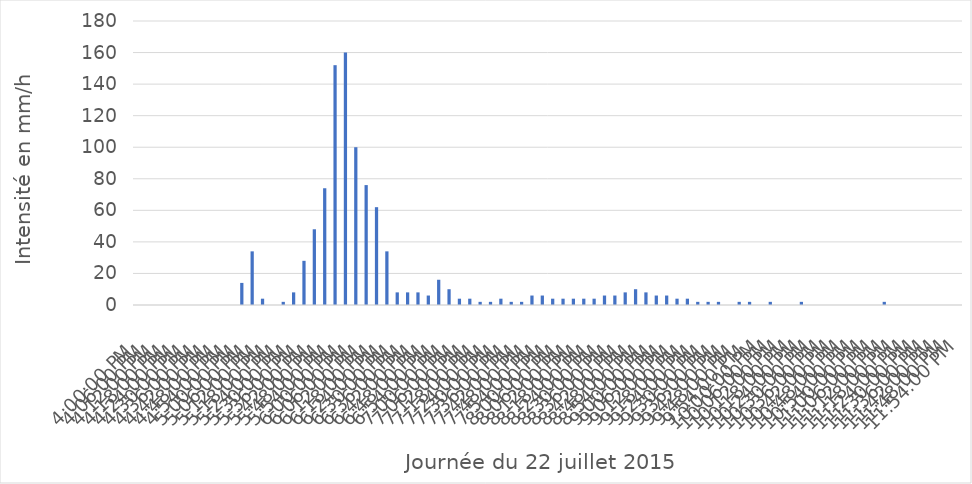
| Category | Series 0 |
|---|---|
| 2015-07-22 16:00:00 | 0 |
| 2015-07-22 16:06:00 | 0 |
| 2015-07-22 16:12:00 | 0 |
| 2015-07-22 16:18:00 | 0 |
| 2015-07-22 16:24:00 | 0 |
| 2015-07-22 16:30:00 | 0 |
| 2015-07-22 16:36:00 | 0 |
| 2015-07-22 16:42:00 | 0 |
| 2015-07-22 16:48:00 | 0 |
| 2015-07-22 16:54:00 | 0 |
| 2015-07-22 17:00:00 | 14 |
| 2015-07-22 17:06:00 | 34 |
| 2015-07-22 17:12:00 | 4 |
| 2015-07-22 17:18:00 | 0 |
| 2015-07-22 17:24:00 | 2 |
| 2015-07-22 17:30:00 | 8 |
| 2015-07-22 17:36:00 | 28 |
| 2015-07-22 17:42:00 | 48 |
| 2015-07-22 17:48:00 | 74 |
| 2015-07-22 17:54:00 | 152 |
| 2015-07-22 18:00:00 | 160 |
| 2015-07-22 18:06:00 | 100 |
| 2015-07-22 18:12:00 | 76 |
| 2015-07-22 18:18:00 | 62 |
| 2015-07-22 18:24:00 | 34 |
| 2015-07-22 18:30:00 | 8 |
| 2015-07-22 18:36:00 | 8 |
| 2015-07-22 18:42:00 | 8 |
| 2015-07-22 18:48:00 | 6 |
| 2015-07-22 18:54:00 | 16 |
| 2015-07-22 19:00:00 | 10 |
| 2015-07-22 19:06:00 | 4 |
| 2015-07-22 19:12:00 | 4 |
| 2015-07-22 19:18:00 | 2 |
| 2015-07-22 19:24:00 | 2 |
| 2015-07-22 19:30:00 | 4 |
| 2015-07-22 19:36:00 | 2 |
| 2015-07-22 19:42:00 | 2 |
| 2015-07-22 19:48:00 | 6 |
| 2015-07-22 19:54:00 | 6 |
| 2015-07-22 20:00:00 | 4 |
| 2015-07-22 20:06:00 | 4 |
| 2015-07-22 20:12:00 | 4 |
| 2015-07-22 20:18:00 | 4 |
| 2015-07-22 20:24:00 | 4 |
| 2015-07-22 20:30:00 | 6 |
| 2015-07-22 20:36:00 | 6 |
| 2015-07-22 20:42:00 | 8 |
| 2015-07-22 20:48:00 | 10 |
| 2015-07-22 20:54:00 | 8 |
| 2015-07-22 21:00:00 | 6 |
| 2015-07-22 21:06:00 | 6 |
| 2015-07-22 21:12:00 | 4 |
| 2015-07-22 21:18:00 | 4 |
| 2015-07-22 21:24:00 | 2 |
| 2015-07-22 21:30:00 | 2 |
| 2015-07-22 21:36:00 | 2 |
| 2015-07-22 21:42:00 | 0 |
| 2015-07-22 21:48:00 | 2 |
| 2015-07-22 21:54:00 | 2 |
| 2015-07-22 22:00:00 | 0 |
| 2015-07-22 22:06:00 | 2 |
| 2015-07-22 22:12:00 | 0 |
| 2015-07-22 22:18:00 | 0 |
| 2015-07-22 22:24:00 | 2 |
| 2015-07-22 22:30:00 | 0 |
| 2015-07-22 22:36:00 | 0 |
| 2015-07-22 22:42:00 | 0 |
| 2015-07-22 22:48:00 | 0 |
| 2015-07-22 22:54:00 | 0 |
| 2015-07-22 23:00:00 | 0 |
| 2015-07-22 23:06:00 | 0 |
| 2015-07-22 23:12:00 | 2 |
| 2015-07-22 23:18:00 | 0 |
| 2015-07-22 23:24:00 | 0 |
| 2015-07-22 23:30:00 | 0 |
| 2015-07-22 23:36:00 | 0 |
| 2015-07-22 23:42:00 | 0 |
| 2015-07-22 23:48:00 | 0 |
| 2015-07-22 23:54:00 | 0 |